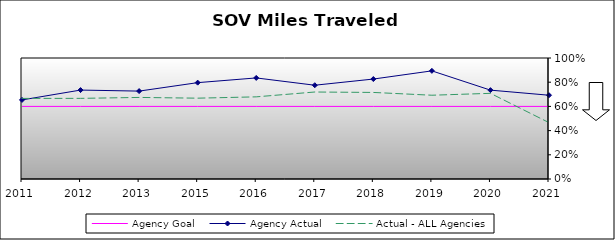
| Category | Agency Goal | Agency Actual | Actual - ALL Agencies |
|---|---|---|---|
| 2011.0 | 0.6 | 0.654 | 0.666 |
| 2012.0 | 0.6 | 0.735 | 0.666 |
| 2013.0 | 0.6 | 0.726 | 0.674 |
| 2015.0 | 0.6 | 0.796 | 0.668 |
| 2016.0 | 0.6 | 0.835 | 0.679 |
| 2017.0 | 0.6 | 0.775 | 0.719 |
| 2018.0 | 0.6 | 0.826 | 0.715 |
| 2019.0 | 0.6 | 0.894 | 0.692 |
| 2020.0 | 0.6 | 0.734 | 0.708 |
| 2021.0 | 0.6 | 0.692 | 0.466 |